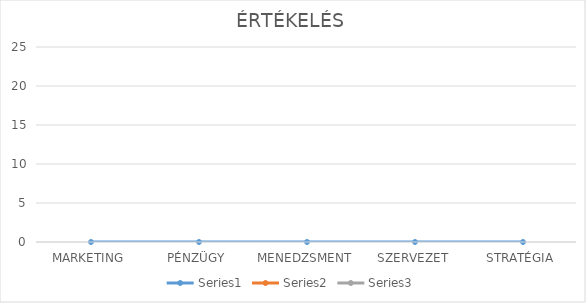
| Category | Series 0 | Series 1 | Series 2 |
|---|---|---|---|
| MARKETING | 0 |  |  |
| PÉNZÜGY | 0 |  |  |
| MENEDZSMENT | 0 |  |  |
| SZERVEZET | 0 |  |  |
| STRATÉGIA | 0 |  |  |